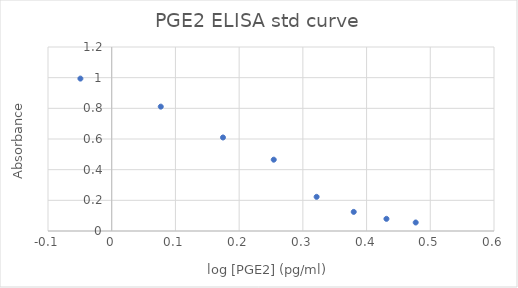
| Category | Series 0 |
|---|---|
| 0.47712125471966244 | 0.056 |
| 0.4312028845565166 | 0.079 |
| 0.3798491787628299 | 0.125 |
| 0.32159843046534387 | 0.223 |
| 0.2543063323312856 | 0.465 |
| 0.17464119266044847 | 0.61 |
| 0.07700432679335026 | 0.811 |
| -0.049148541111453566 | 0.994 |